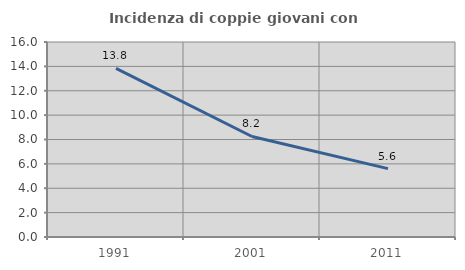
| Category | Incidenza di coppie giovani con figli |
|---|---|
| 1991.0 | 13.835 |
| 2001.0 | 8.249 |
| 2011.0 | 5.612 |